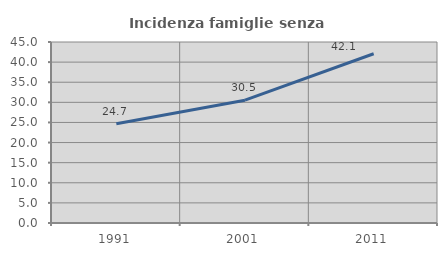
| Category | Incidenza famiglie senza nuclei |
|---|---|
| 1991.0 | 24.665 |
| 2001.0 | 30.539 |
| 2011.0 | 42.071 |